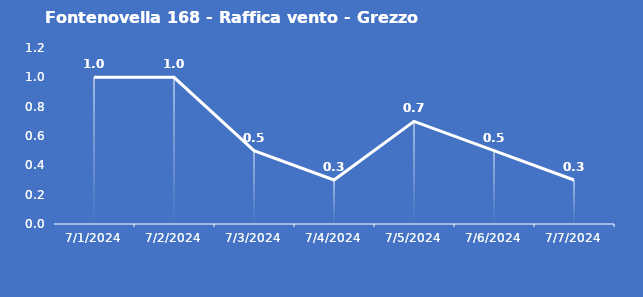
| Category | Fontenovella 168 - Raffica vento - Grezzo (m/s) |
|---|---|
| 7/1/24 | 1 |
| 7/2/24 | 1 |
| 7/3/24 | 0.5 |
| 7/4/24 | 0.3 |
| 7/5/24 | 0.7 |
| 7/6/24 | 0.5 |
| 7/7/24 | 0.3 |